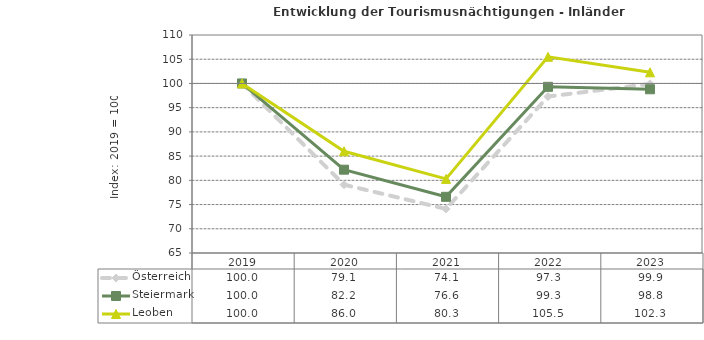
| Category | Österreich | Steiermark | Leoben |
|---|---|---|---|
| 2023.0 | 99.9 | 98.8 | 102.3 |
| 2022.0 | 97.3 | 99.3 | 105.5 |
| 2021.0 | 74.1 | 76.6 | 80.3 |
| 2020.0 | 79.1 | 82.2 | 86 |
| 2019.0 | 100 | 100 | 100 |